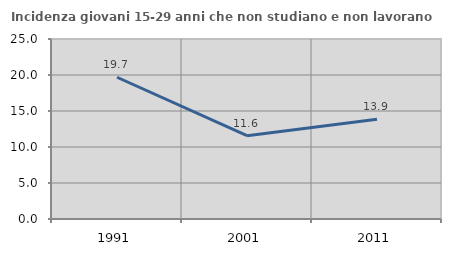
| Category | Incidenza giovani 15-29 anni che non studiano e non lavorano  |
|---|---|
| 1991.0 | 19.688 |
| 2001.0 | 11.575 |
| 2011.0 | 13.855 |